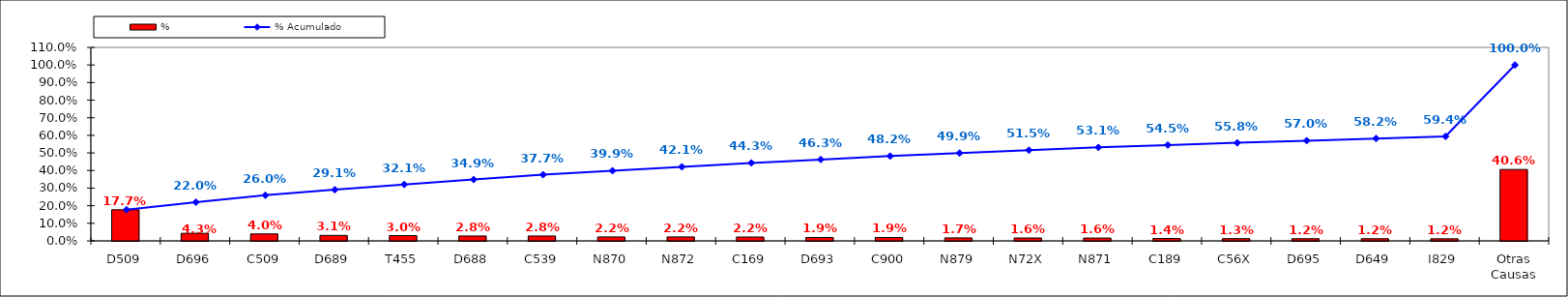
| Category | % |
|---|---|
| D509 | 0.177 |
| D696 | 0.043 |
| C509 | 0.04 |
| D689 | 0.031 |
| T455 | 0.03 |
| D688 | 0.028 |
| C539 | 0.028 |
| N870 | 0.022 |
| N872 | 0.022 |
| C169 | 0.022 |
| D693 | 0.019 |
| C900 | 0.019 |
| N879 | 0.017 |
| N72X | 0.016 |
| N871 | 0.016 |
| C189 | 0.014 |
| C56X | 0.013 |
| D695 | 0.012 |
| D649 | 0.012 |
| I829 | 0.012 |
| Otras Causas | 0.406 |